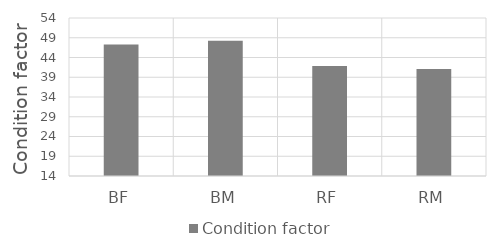
| Category | Condition factor |
|---|---|
| BF | 47.284 |
| BM | 48.27 |
| RF | 41.856 |
| RM | 41.083 |